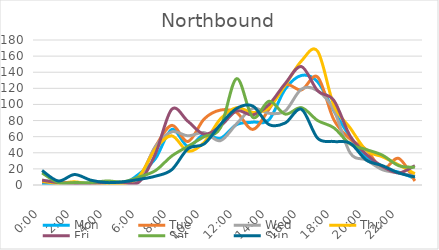
| Category | Mon | Tue | Wed | Thu | Fri | Sat | Sun |
|---|---|---|---|---|---|---|---|
| 0.0 | 2 | 4 | 6 | 5 | 6 | 15 | 18 |
| 0.041667 | 2 | 3 | 3 | 2 | 3 | 3 | 5 |
| 0.083333 | 2 | 1 | 2 | 4 | 2 | 3 | 13 |
| 0.125 | 2 | 1 | 1 | 1 | 2 | 3 | 6 |
| 0.166667 | 0 | 1 | 4 | 2 | 3 | 5 | 3 |
| 0.208333 | 1 | 2 | 2 | 1 | 3 | 4 | 4 |
| 0.25 | 14 | 10 | 9 | 11 | 4 | 10 | 7 |
| 0.291667 | 33 | 48 | 48 | 45 | 39 | 18 | 11 |
| 0.333333 | 69 | 74 | 66 | 61 | 94 | 36 | 19 |
| 0.375 | 48 | 54 | 61 | 42 | 79 | 48 | 45 |
| 0.416667 | 63 | 82 | 65 | 53 | 63 | 60 | 51 |
| 0.458333 | 58 | 93 | 55 | 82 | 73 | 71 | 75 |
| 0.5 | 75 | 90 | 76 | 96 | 92 | 132 | 95 |
| 0.541667 | 78 | 69 | 95 | 90 | 87 | 84 | 98 |
| 0.5833333333333334 | 81 | 94 | 89 | 96 | 100 | 104 | 75 |
| 0.625 | 119 | 124 | 92 | 124 | 126 | 88 | 77 |
| 0.666667 | 136 | 118 | 119 | 154 | 147 | 96 | 94 |
| 0.708333 | 128 | 134 | 117 | 166 | 117 | 80 | 58 |
| 0.75 | 92 | 81 | 93 | 99 | 105 | 71 | 54 |
| 0.791667 | 60 | 57 | 40 | 71 | 61 | 51 | 52 |
| 0.833333 | 35 | 44 | 31 | 43 | 38 | 44 | 31 |
| 0.875 | 20 | 20 | 19 | 35 | 23 | 37 | 24 |
| 0.916667 | 16 | 33 | 15 | 25 | 15 | 24 | 15 |
| 0.958333 | 8 | 5 | 11 | 14 | 24 | 22 | 10 |